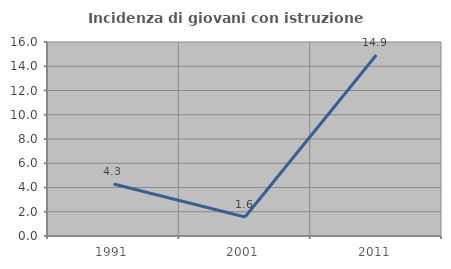
| Category | Incidenza di giovani con istruzione universitaria |
|---|---|
| 1991.0 | 4.286 |
| 2001.0 | 1.562 |
| 2011.0 | 14.925 |